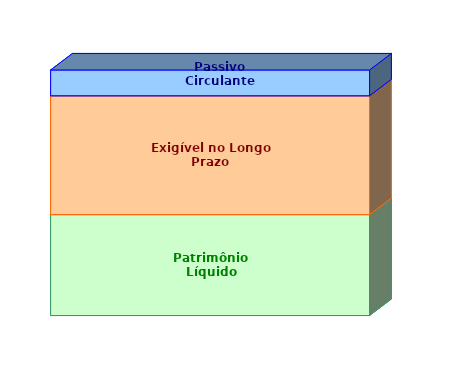
| Category | Patrimônio Líquido | Exigível no Longo Prazo | Passivo Circulante |
|---|---|---|---|
| 0 | 0.411 | 0.484 | 0.105 |